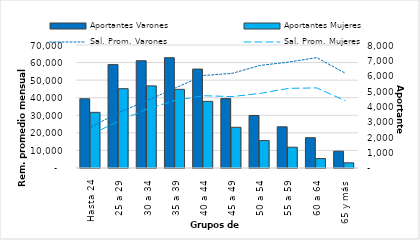
| Category | Aportantes Varones | Aportantes Mujeres |
|---|---|---|
| Hasta 24 | 4503 | 3619 |
| 25 a 29 | 6725 | 5159 |
| 30 a 34 | 6978 | 5340 |
| 35 a 39 | 7173 | 5116 |
| 40 a 44 | 6434 | 4334 |
| 45 a 49 | 4515 | 2647 |
| 50 a 54 | 3415 | 1784 |
| 55 a 59 | 2680 | 1352 |
| 60 a 64 | 1971 | 615 |
| 65 y más | 1094 | 337 |